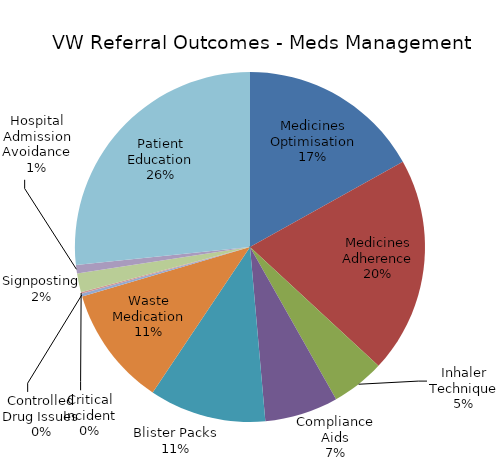
| Category | Series 0 |
|---|---|
| Medicines Optimisation | 127 |
| Medicines Adherence | 150 |
| Inhaler Technique | 37 |
| Compliance Aids | 51 |
| Blister Packs | 81 |
| Waste Medication | 83 |
| Controlled Drug Issues | 2 |
| Critical Incident | 1 |
| Signposting | 13 |
| Hospital Admission Avoidance | 6 |
| Patient Education | 200 |